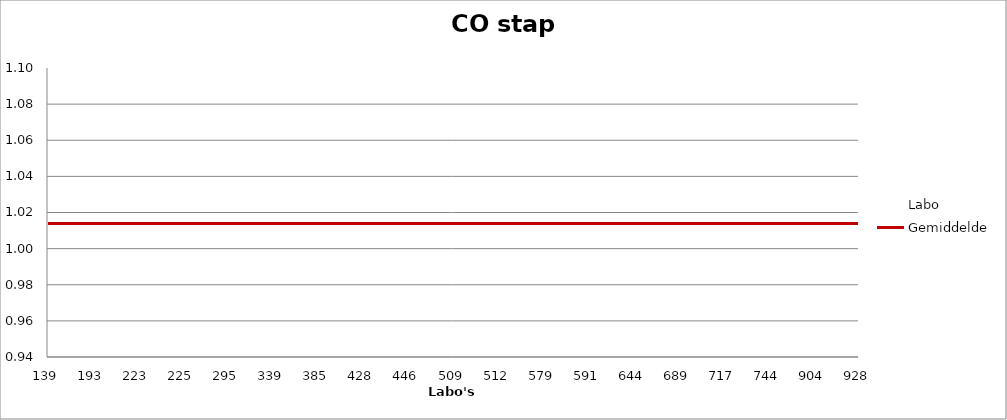
| Category | Labo | Gemiddelde |
|---|---|---|
| 139.0 | 1.018 | 1.014 |
| 193.0 | 1.085 | 1.014 |
| 223.0 | 1.027 | 1.014 |
| 225.0 | 1.018 | 1.014 |
| 295.0 | 0.989 | 1.014 |
| 339.0 | 1.018 | 1.014 |
| 385.0 | 1.008 | 1.014 |
| 428.0 | 1.008 | 1.014 |
| 446.0 | 1.008 | 1.014 |
| 509.0 | 1.018 | 1.014 |
| 512.0 | 1.008 | 1.014 |
| 579.0 | 1.027 | 1.014 |
| 591.0 | 1.008 | 1.014 |
| 644.0 | 1.027 | 1.014 |
| 689.0 | 1.018 | 1.014 |
| 717.0 | 0.999 | 1.014 |
| 744.0 | 1.008 | 1.014 |
| 904.0 | 1.018 | 1.014 |
| 928.0 | 0.97 | 1.014 |